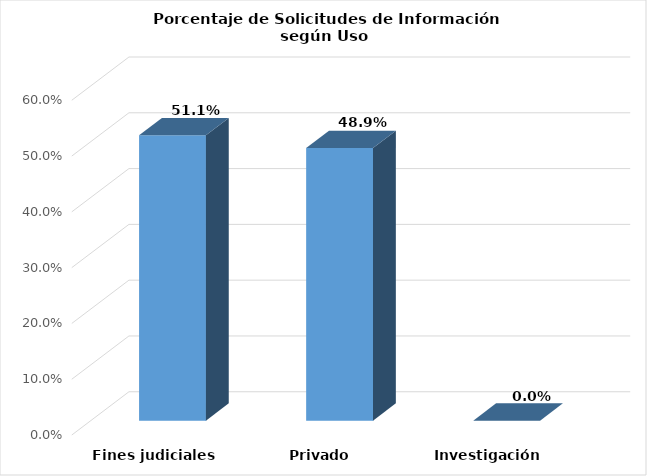
| Category | Series 0 |
|---|---|
| Fines judiciales | 0.511 |
| Privado | 0.489 |
| Investigación | 0 |